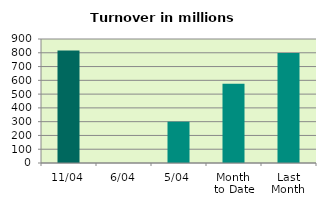
| Category | Series 0 |
|---|---|
| 11/04 | 815.956 |
| 6/04 | 0 |
| 5/04 | 299.961 |
| Month 
to Date | 575.345 |
| Last
Month | 798.115 |